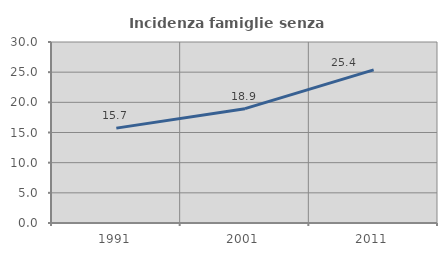
| Category | Incidenza famiglie senza nuclei |
|---|---|
| 1991.0 | 15.726 |
| 2001.0 | 18.949 |
| 2011.0 | 25.388 |